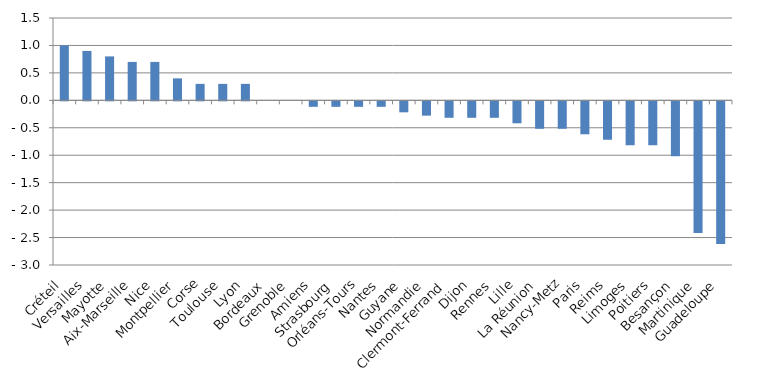
| Category | Évolution en % |
|---|---|
| Créteil | 1 |
| Versailles | 0.9 |
| Mayotte | 0.8 |
| Aix-Marseille | 0.7 |
| Nice | 0.7 |
| Montpellier | 0.4 |
| Corse | 0.3 |
| Toulouse | 0.3 |
| Lyon | 0.3 |
| Bordeaux | 0 |
| Grenoble | 0 |
| Amiens | -0.1 |
| Strasbourg | -0.1 |
| Orléans-Tours | -0.1 |
| Nantes | -0.1 |
| Guyane | -0.2 |
| Normandie | -0.261 |
| Clermont-Ferrand | -0.3 |
| Dijon | -0.3 |
| Rennes | -0.3 |
| Lille | -0.4 |
| La Réunion | -0.5 |
| Nancy-Metz | -0.5 |
| Paris | -0.6 |
| Reims | -0.7 |
| Limoges | -0.8 |
| Poitiers | -0.8 |
| Besançon | -1 |
| Martinique | -2.4 |
| Guadeloupe | -2.6 |